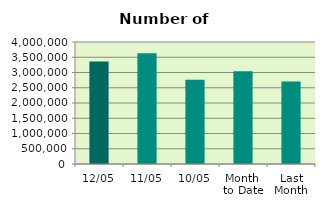
| Category | Series 0 |
|---|---|
| 12/05 | 3362004 |
| 11/05 | 3631176 |
| 10/05 | 2760316 |
| Month 
to Date | 3041031.75 |
| Last
Month | 2707305.9 |